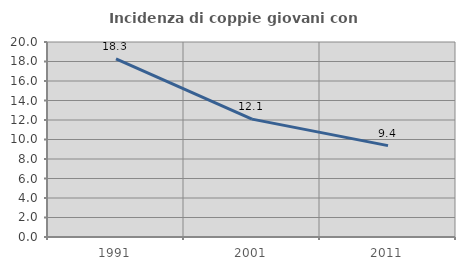
| Category | Incidenza di coppie giovani con figli |
|---|---|
| 1991.0 | 18.282 |
| 2001.0 | 12.092 |
| 2011.0 | 9.371 |